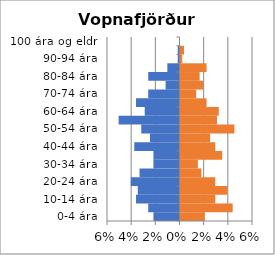
| Category | % karlar | %konur |
|---|---|---|
| 0-4 ára | -0.022 | 0.02 |
| 5-9 ára | -0.026 | 0.043 |
| 10-14 ára | -0.036 | 0.029 |
| 15-19 ára | -0.035 | 0.039 |
| 20-24 ára | -0.04 | 0.029 |
| 25-29 ára | -0.033 | 0.017 |
| 30-34 ára | -0.022 | 0.014 |
| 35-39 ára | -0.022 | 0.035 |
| 40-44 ára | -0.037 | 0.029 |
| 45-49 ára | -0.024 | 0.024 |
| 50-54 ára | -0.032 | 0.045 |
| 55-59 ára | -0.05 | 0.03 |
| 60-64 ára | -0.029 | 0.032 |
| 65-69 ára | -0.036 | 0.022 |
| 70-74 ára | -0.026 | 0.013 |
| 75-79 ára | -0.012 | 0.019 |
| 80-84 ára | -0.026 | 0.016 |
| 85-89 ára | -0.01 | 0.022 |
| 90-94 ára | -0.001 | 0.001 |
| 95-99 ára | -0.001 | 0.003 |
| 100 ára og eldri | 0 | 0 |